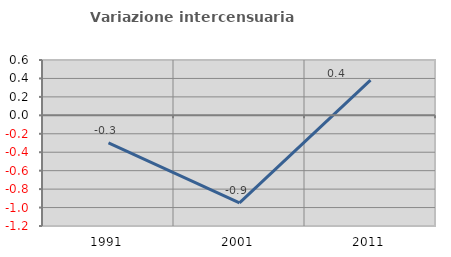
| Category | Variazione intercensuaria annua |
|---|---|
| 1991.0 | -0.298 |
| 2001.0 | -0.949 |
| 2011.0 | 0.382 |